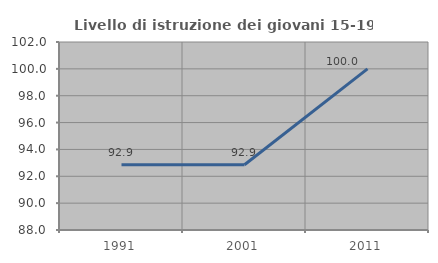
| Category | Livello di istruzione dei giovani 15-19 anni |
|---|---|
| 1991.0 | 92.857 |
| 2001.0 | 92.857 |
| 2011.0 | 100 |